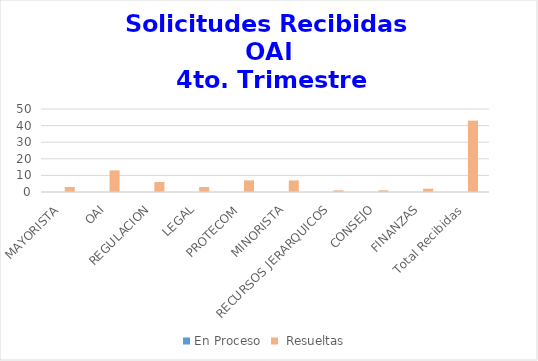
| Category | En Proceso |  Resueltas  |
|---|---|---|
| MAYORISTA | 0 | 3 |
| OAI | 0 | 13 |
| REGULACION | 0 | 6 |
| LEGAL | 0 | 3 |
| PROTECOM | 0 | 7 |
| MINORISTA | 0 | 7 |
| RECURSOS JERARQUICOS | 0 | 1 |
| CONSEJO | 0 | 1 |
| FINANZAS | 0 | 2 |
| Total Recibidas | 0 | 43 |